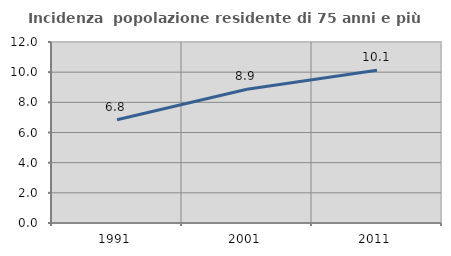
| Category | Incidenza  popolazione residente di 75 anni e più |
|---|---|
| 1991.0 | 6.841 |
| 2001.0 | 8.863 |
| 2011.0 | 10.129 |